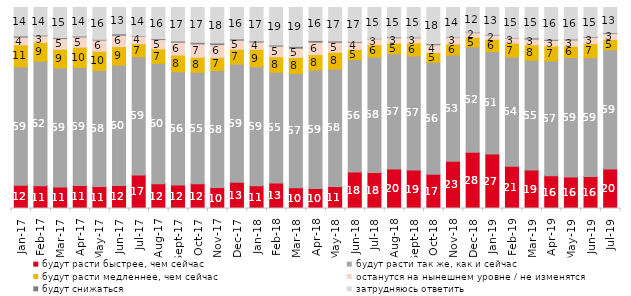
| Category | будут расти быстрее, чем сейчас | будут расти так же, как и сейчас | будут расти медленнее, чем сейчас | останутся на нынешнем уровне / не изменятся | будут снижаться | затрудняюсь ответить |
|---|---|---|---|---|---|---|
| 2017-01-01 | 11.6 | 58.85 | 10.95 | 3.85 | 0.6 | 14.15 |
| 2017-02-01 | 11.35 | 61.95 | 9.3 | 3.3 | 0.35 | 13.75 |
| 2017-03-01 | 10.7 | 59.25 | 9.25 | 5.35 | 0.45 | 15 |
| 2017-04-01 | 11.45 | 58.75 | 10.05 | 5.1 | 0.45 | 14.2 |
| 2017-05-01 | 11 | 57.65 | 9.6 | 5.55 | 0.35 | 15.85 |
| 2017-06-01 | 11.5 | 59.85 | 9.2 | 5.65 | 0.7 | 13.1 |
| 2017-07-01 | 16.7 | 58.8 | 6.5 | 3.75 | 0.25 | 14 |
| 2017-08-01 | 12.35 | 59.85 | 7.2 | 4.65 | 0.45 | 15.5 |
| 2017-09-01 | 11.75 | 56.25 | 8.35 | 6.4 | 0.6 | 16.65 |
| 2017-10-01 | 12.3 | 55.45 | 7.5 | 6.65 | 0.75 | 17.35 |
| 2017-11-01 | 10.4 | 58.25 | 6.55 | 6.35 | 0.8 | 17.65 |
| 2017-12-01 | 13.1 | 58.7 | 7.4 | 4.55 | 0.65 | 15.6 |
| 2018-01-01 | 11.35 | 59.2 | 8.6 | 3.65 | 0.6 | 16.6 |
| 2018-02-01 | 12.7 | 55.05 | 7.75 | 5.3 | 0.55 | 18.65 |
| 2018-03-01 | 10.3 | 56.85 | 8 | 4.6 | 0.9 | 19.35 |
| 2018-04-01 | 9.9 | 59 | 7.65 | 6.2 | 0.85 | 16.4 |
| 2018-05-01 | 10.95 | 58.4 | 8.4 | 4.95 | 0.65 | 16.65 |
| 2018-06-01 | 18.15 | 55.9 | 5.05 | 3.6 | 0.4 | 16.9 |
| 2018-07-01 | 17.85 | 57.5 | 6.15 | 2.95 | 0.2 | 15.35 |
| 2018-08-01 | 19.65 | 57.35 | 5.25 | 2.7 | 0.4 | 14.65 |
| 2018-09-01 | 19.1 | 56.85 | 6.4 | 2.6 | 0.3 | 14.75 |
| 2018-10-01 | 17.1 | 55.65 | 4.8 | 3.95 | 0.5 | 18 |
| 2018-11-01 | 23.453 | 52.894 | 5.539 | 3.443 | 0.2 | 14.471 |
| 2018-12-01 | 27.95 | 52.45 | 4.8 | 2.25 | 0.3 | 12.25 |
| 2019-01-01 | 27.15 | 50.9 | 6.1 | 2.15 | 0.3 | 13.4 |
| 2019-02-01 | 21.05 | 54.35 | 6.85 | 2.55 | 0.2 | 15 |
| 2019-03-01 | 19.095 | 54.649 | 7.708 | 2.834 | 0.597 | 15.117 |
| 2019-04-01 | 16.287 | 57.178 | 7.376 | 2.822 | 0.495 | 15.842 |
| 2019-05-01 | 15.701 | 59.435 | 5.646 | 3.071 | 0.446 | 15.701 |
| 2019-06-01 | 15.86 | 59.202 | 6.983 | 3.092 | 0.349 | 14.514 |
| 2019-07-01 | 19.604 | 59.406 | 5.099 | 2.921 | 0.396 | 12.574 |